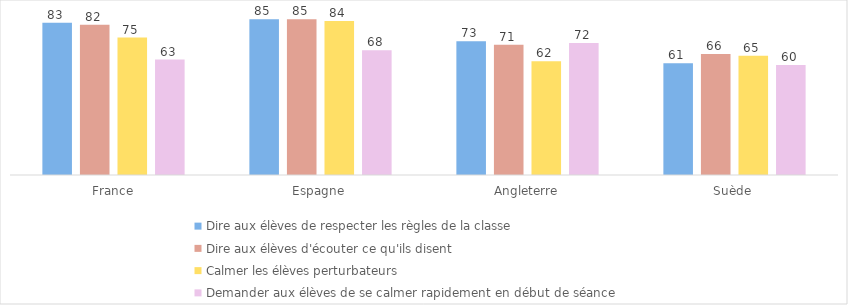
| Category | Dire aux élèves de respecter les règles de la classe | Dire aux élèves d'écouter ce qu'ils disent | Calmer les élèves perturbateurs | Demander aux élèves de se calmer rapidement en début de séance |
|---|---|---|---|---|
| France | 83 | 82 | 75 | 63 |
| Espagne | 85 | 85 | 84 | 68 |
| Angleterre | 73 | 71 | 62 | 72 |
| Suède | 61 | 66 | 65 | 60 |